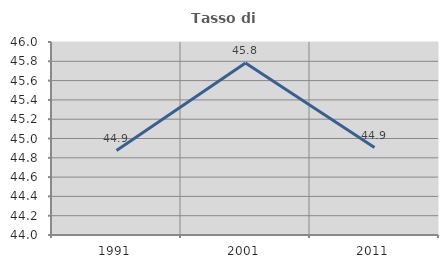
| Category | Tasso di occupazione   |
|---|---|
| 1991.0 | 44.875 |
| 2001.0 | 45.783 |
| 2011.0 | 44.906 |